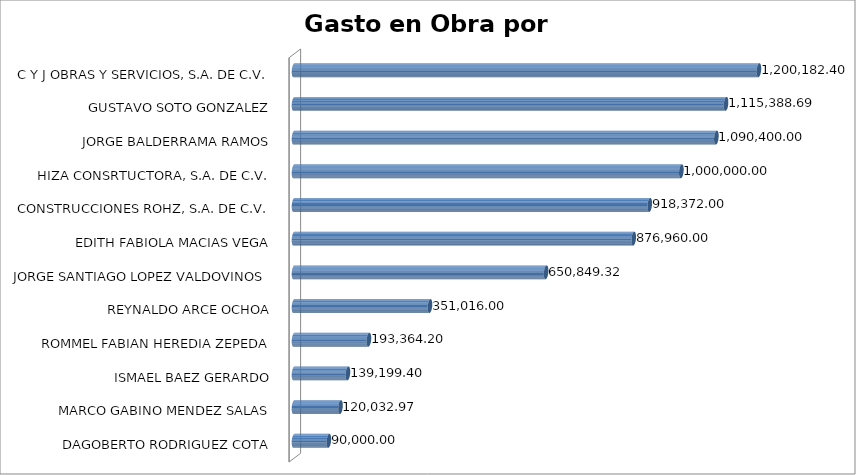
| Category | Suma |
|---|---|
| DAGOBERTO RODRIGUEZ COTA | 90000 |
| MARCO GABINO MENDEZ SALAS | 120032.97 |
| ISMAEL BAEZ GERARDO | 139199.4 |
| ROMMEL FABIAN HEREDIA ZEPEDA | 193364.2 |
| REYNALDO ARCE OCHOA | 351016 |
| JORGE SANTIAGO LOPEZ VALDOVINOS  | 650849.32 |
| EDITH FABIOLA MACIAS VEGA | 876960 |
| CONSTRUCCIONES ROHZ, S.A. DE C.V. | 918372 |
| HIZA CONSRTUCTORA, S.A. DE C.V. | 1000000 |
| JORGE BALDERRAMA RAMOS | 1090400 |
| GUSTAVO SOTO GONZALEZ | 1115388.69 |
| C Y J OBRAS Y SERVICIOS, S.A. DE C.V. | 1200182.4 |